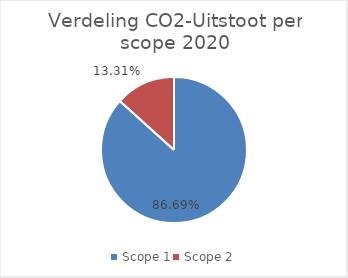
| Category | Series 0 |
|---|---|
| Scope 1 | 0.867 |
| Scope 2 | 0.133 |